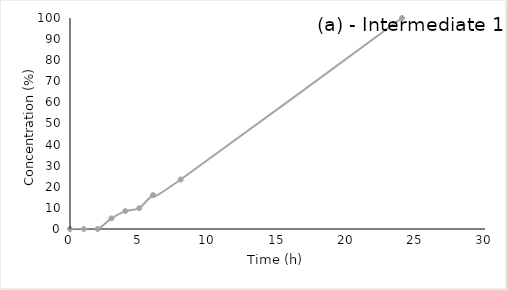
| Category | Series 2 |
|---|---|
| 0.0 | 0 |
| 1.0 | 0 |
| 2.0 | 0 |
| 3.0 | 5.045 |
| 4.0 | 8.483 |
| 5.0 | 9.869 |
| 6.0 | 16.08 |
| 8.0 | 23.448 |
| 24.0 | 100 |